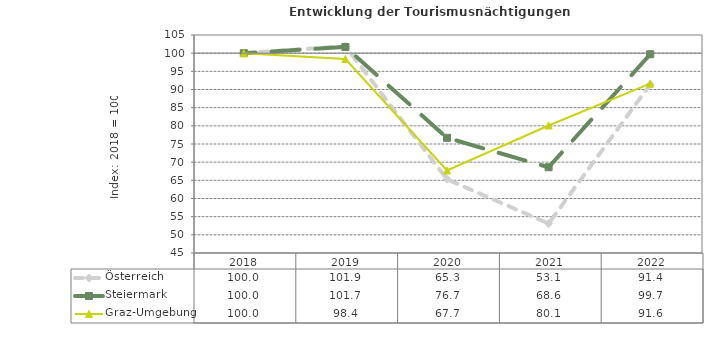
| Category | Österreich | Steiermark | Graz-Umgebung |
|---|---|---|---|
| 2022.0 | 91.4 | 99.7 | 91.6 |
| 2021.0 | 53.1 | 68.6 | 80.1 |
| 2020.0 | 65.3 | 76.7 | 67.7 |
| 2019.0 | 101.9 | 101.7 | 98.4 |
| 2018.0 | 100 | 100 | 100 |